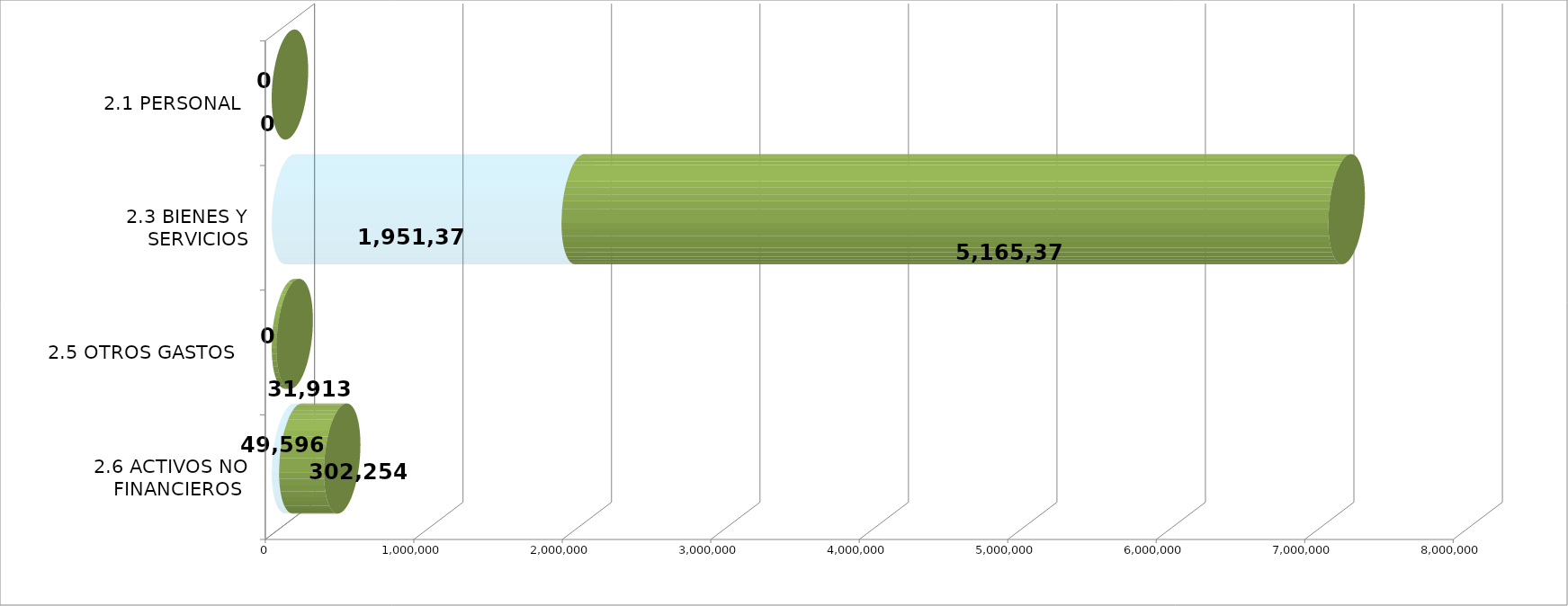
| Category | EJECUTADO | SALDO  |
|---|---|---|
| 2.1 PERSONAL | 0 | 0 |
| 2.3 BIENES Y SERVICIOS | 1951375.42 | 5165369.58 |
| 2.5 OTROS GASTOS  | 0 | 31913 |
| 2.6 ACTIVOS NO FINANCIEROS  | 49596.32 | 302253.68 |